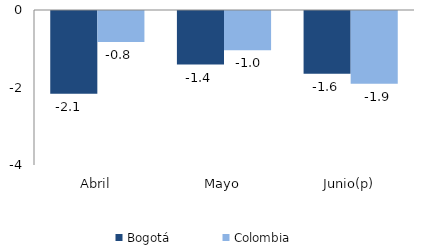
| Category | Bogotá | Colombia |
|---|---|---|
| Abril | -2.133 | -0.797 |
| Mayo | -1.383 | -1.013 |
| Junio(p) | -1.617 | -1.875 |